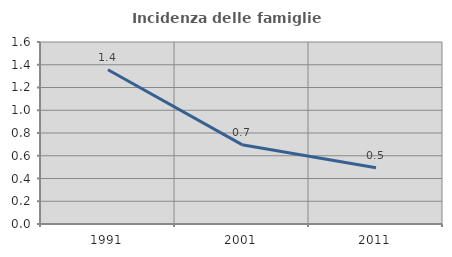
| Category | Incidenza delle famiglie numerose |
|---|---|
| 1991.0 | 1.356 |
| 2001.0 | 0.698 |
| 2011.0 | 0.494 |